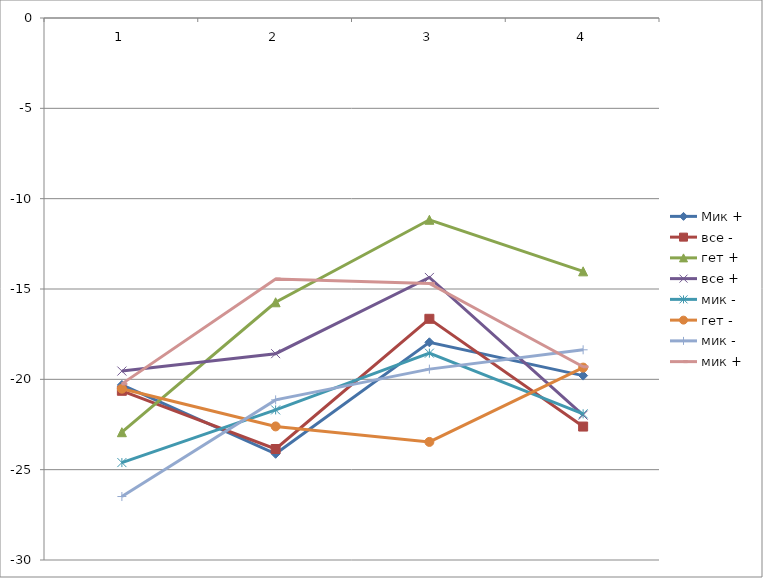
| Category | Мик + | все - | гет + | все + | мик - | гет - | мик + |
|---|---|---|---|---|---|---|---|
| 0 | -20.311 | -20.634 | -22.927 | -19.542 | -26.486 | -20.519 | -20.251 |
| 1 | -24.122 | -23.857 | -15.735 | -18.579 | -21.138 | -22.606 | -14.45 |
| 2 | -17.95 | -16.65 | -11.168 | -14.361 | -19.435 | -23.464 | -14.69 |
| 3 | -19.793 | -22.614 | -14.023 | -21.98 | -18.365 | -19.35 | -19.306 |